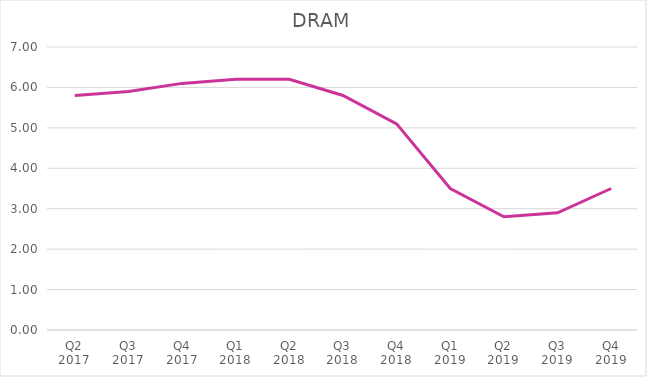
| Category | Series 0 |
|---|---|
| Q2 2017 | 5.8 |
| Q3 2017 | 5.9 |
| Q4 2017 | 6.1 |
| Q1 2018 | 6.2 |
| Q2 2018 | 6.2 |
| Q3 2018 | 5.8 |
| Q4 2018 | 5.1 |
| Q1 2019 | 3.5 |
| Q2 2019 | 2.8 |
| Q3 2019 | 2.9 |
| Q4 2019 | 3.5 |